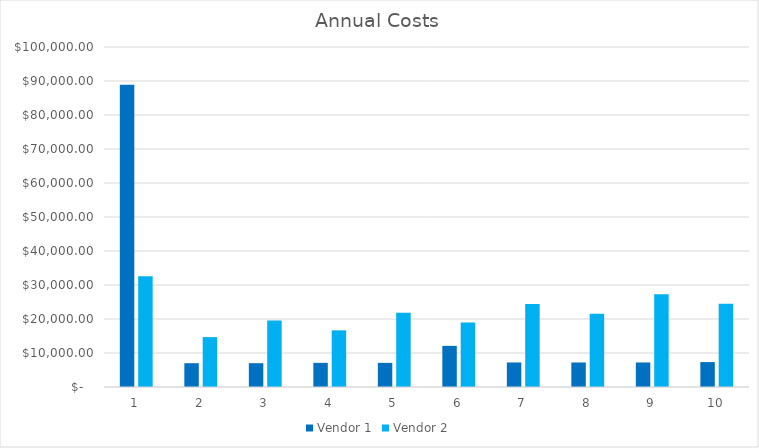
| Category | Vendor 1 | Vendor 2 |
|---|---|---|
| 0 | 88900 | 32600 |
| 1 | 7000 | 14672 |
| 2 | 7000 | 19572.64 |
| 3 | 7100 | 16662.957 |
| 4 | 7100 | 21820.712 |
| 5 | 12100 | 18934.005 |
| 6 | 7210 | 24384.852 |
| 7 | 7210 | 21526.967 |
| 8 | 7210 | 27312.208 |
| 9 | 7331 | 24490.478 |